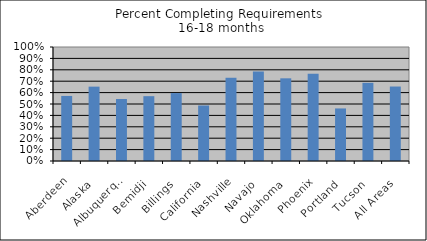
| Category | % Comp. Req. |
|---|---|
| Aberdeen | 0.571 |
| Alaska | 0.652 |
| Albuquerque | 0.544 |
| Bemidji | 0.569 |
| Billings | 0.596 |
| California | 0.487 |
| Nashville | 0.73 |
| Navajo | 0.785 |
| Oklahoma | 0.725 |
| Phoenix | 0.766 |
| Portland | 0.461 |
| Tucson | 0.686 |
| All Areas | 0.653 |